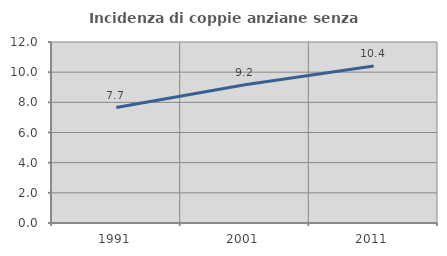
| Category | Incidenza di coppie anziane senza figli  |
|---|---|
| 1991.0 | 7.656 |
| 2001.0 | 9.159 |
| 2011.0 | 10.406 |